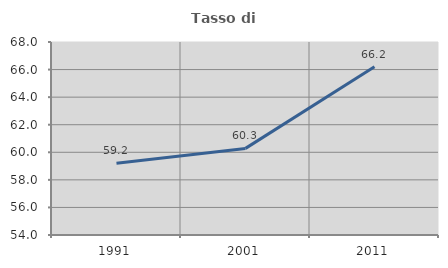
| Category | Tasso di occupazione   |
|---|---|
| 1991.0 | 59.211 |
| 2001.0 | 60.283 |
| 2011.0 | 66.2 |